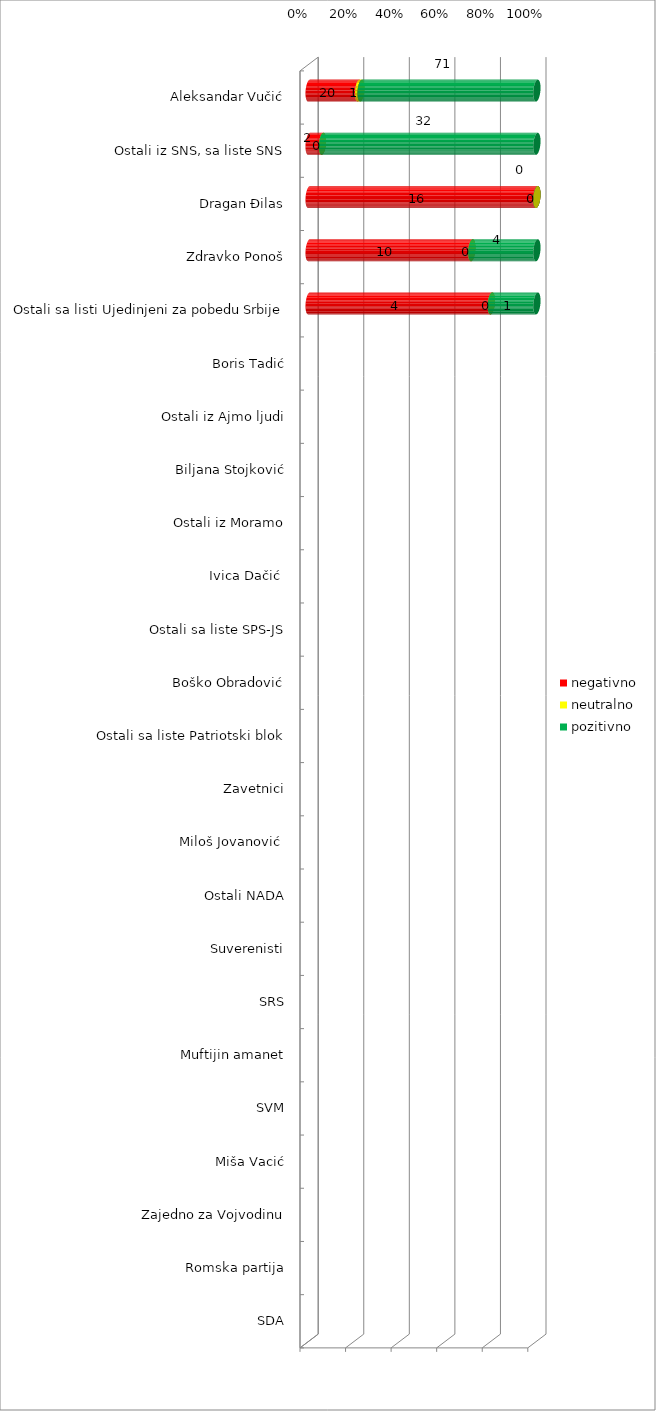
| Category | negativno | neutralno | pozitivno |
|---|---|---|---|
| Aleksandar Vučić | 20 | 1 | 71 |
| Ostali iz SNS, sa liste SNS | 2 | 0 | 32 |
| Dragan Đilas | 16 | 0 | 0 |
| Zdravko Ponoš | 10 | 0 | 4 |
| Ostali sa listi Ujedinjeni za pobedu Srbije | 4 | 0 | 1 |
| Boris Tadić | 0 | 0 | 0 |
| Ostali iz Ajmo ljudi | 0 | 0 | 0 |
| Biljana Stojković | 0 | 0 | 0 |
| Ostali iz Moramo | 0 | 0 | 0 |
| Ivica Dačić  | 0 | 0 | 0 |
| Ostali sa liste SPS-JS | 0 | 0 | 0 |
| Boško Obradović | 0 | 0 | 0 |
| Ostali sa liste Patriotski blok | 0 | 0 | 0 |
| Zavetnici | 0 | 0 | 0 |
| Miloš Jovanović  | 0 | 0 | 0 |
| Ostali NADA | 0 | 0 | 0 |
| Suverenisti | 0 | 0 | 0 |
| SRS | 0 | 0 | 0 |
| Muftijin amanet | 0 | 0 | 0 |
| SVM | 0 | 0 | 0 |
| Miša Vacić | 0 | 0 | 0 |
| Zajedno za Vojvodinu | 0 | 0 | 0 |
| Romska partija | 0 | 0 | 0 |
| SDA | 0 | 0 | 0 |